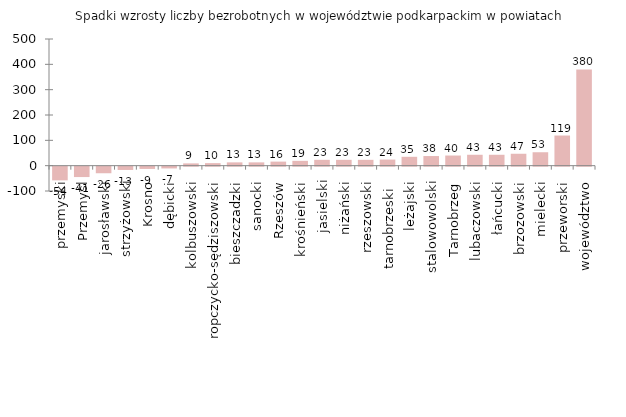
| Category | Spadki wzrosty liczba bezrobotnych w województwie podkarpackim wg powiatów |
|---|---|
| przemyski | -54 |
| Przemyśl | -41 |
| jarosławski | -26 |
| strzyżowski | -13 |
| Krosno | -9 |
| dębicki | -7 |
| kolbuszowski | 9 |
| ropczycko-sędziszowski | 10 |
| bieszczadzki | 13 |
| sanocki | 13 |
| Rzeszów | 16 |
| krośnieński | 19 |
| jasielski | 23 |
| niżański | 23 |
| rzeszowski | 23 |
| tarnobrzeski  | 24 |
| leżajski | 35 |
| stalowowolski | 38 |
| Tarnobrzeg | 40 |
| lubaczowski | 43 |
| łańcucki | 43 |
| brzozowski | 47 |
| mielecki | 53 |
| przeworski | 119 |
| województwo | 380 |